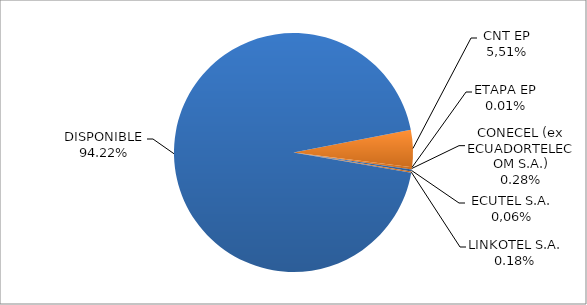
| Category | CODIGO DE AREA 5 |
|---|---|
| CORPORACIÓN NACIONAL TELECOMUNICACIONES CNT EP | 0.05 |
| ETAPA EP | 0 |
| CONECEL (ex ECUADORTELECOM S.A.) | 0.003 |
| SETEL S.A. | 0.003 |
| LINKOTEL S.A. | 0.002 |
| DISPONIBLE | 0.942 |